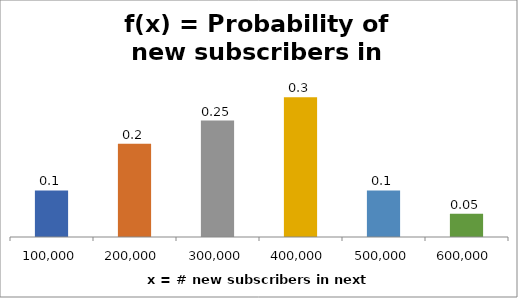
| Category | f(x) = Probability of new subscribers in next year |
|---|---|
| 100000.0 | 0.1 |
| 200000.0 | 0.2 |
| 300000.0 | 0.25 |
| 400000.0 | 0.3 |
| 500000.0 | 0.1 |
| 600000.0 | 0.05 |